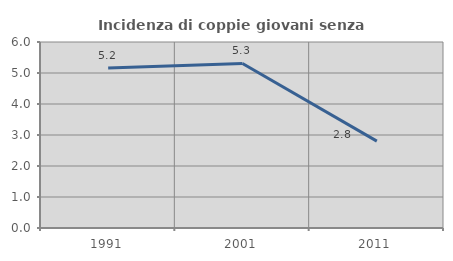
| Category | Incidenza di coppie giovani senza figli |
|---|---|
| 1991.0 | 5.161 |
| 2001.0 | 5.307 |
| 2011.0 | 2.802 |